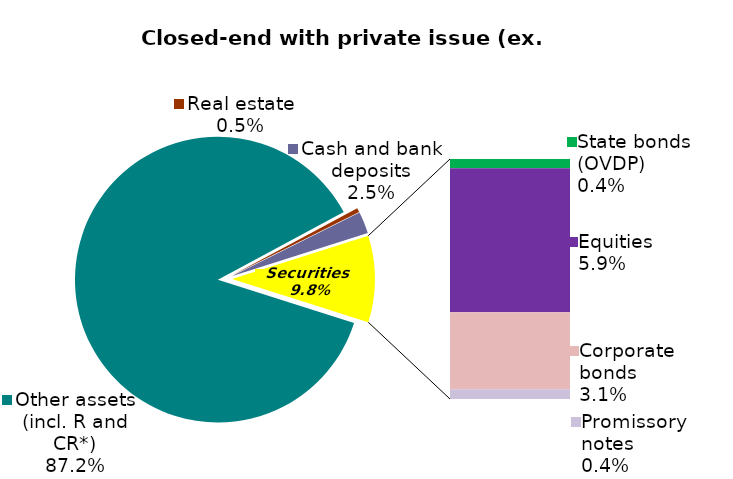
| Category | Series 0 |
|---|---|
| Other assets (incl. R and CR*) | 0.872 |
| Real estate | 0.005 |
| Cash and bank deposits | 0.025 |
| State bonds (OVDP) | 0.004 |
| Equities | 0.059 |
| Corporate bonds | 0.031 |
| Promissory notes | 0.004 |